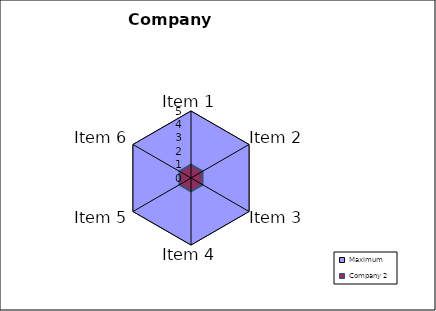
| Category | Maximum | Company 2 |
|---|---|---|
| Item 1 | 5 | 1 |
| Item 2 | 5 | 1 |
| Item 3 | 5 | 1 |
| Item 4 | 5 | 1 |
| Item 5 | 5 | 1 |
| Item 6 | 5 | 1 |